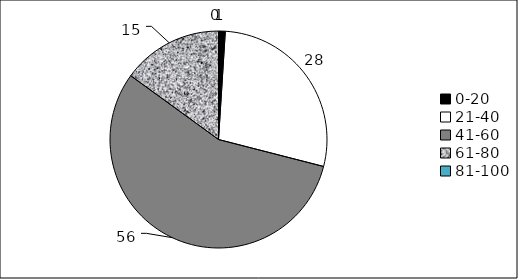
| Category | Series 0 |
|---|---|
| 0-20 | 1 |
| 21-40 | 28 |
| 41-60 | 56 |
| 61-80 | 15 |
| 81-100 | 0 |